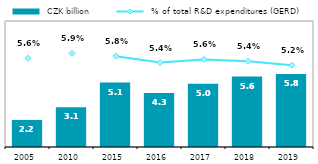
| Category |  CZK billion |
|---|---|
| 2005.0 | 2.15 |
| 2010.0 | 3.147 |
| 2015.0 | 5.112 |
| 2016.0 | 4.295 |
| 2017.0 | 5.024 |
| 2018.0 | 5.594 |
| 2019.0 | 5.791 |